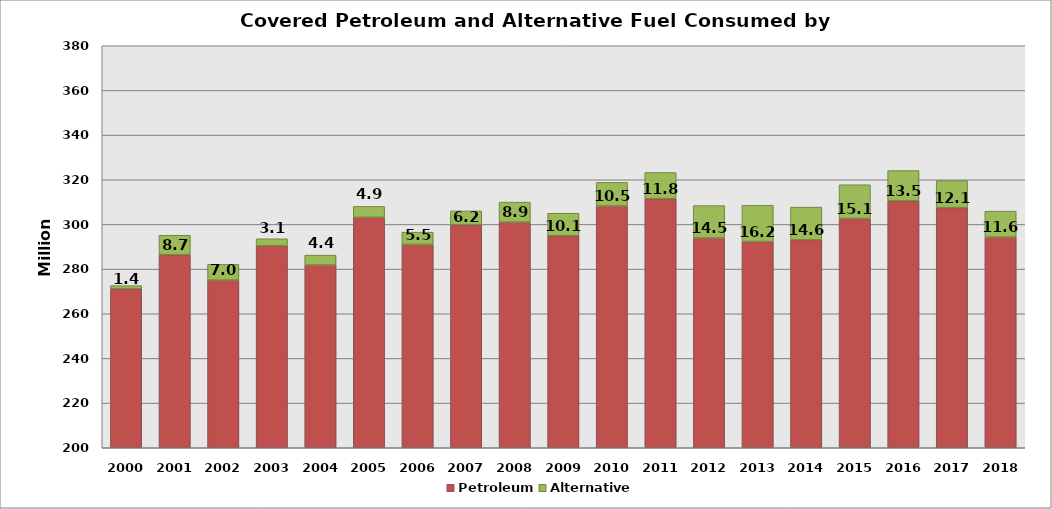
| Category |  Petroleum  | Alternative |
|---|---|---|
| 2000.0 | 271216176 | 1380837 |
| 2001.0 | 286457638 | 8696247 |
| 2002.0 | 275091679 | 7027164 |
| 2003.0 | 290506862 | 3073269 |
| 2004.0 | 281830103 | 4429460 |
| 2005.0 | 303188859 | 4879411 |
| 2006.0 | 291052076 | 5496332 |
| 2007.0 | 299876539 | 6186834 |
| 2008.0 | 301045891 | 8947801 |
| 2009.0 | 294913021 | 10093398 |
| 2010.0 | 308275507 | 10538475 |
| 2011.0 | 311511401 | 11759794 |
| 2012.0 | 293945538 | 14488408 |
| 2013.0 | 292338083 | 16217651 |
| 2014.0 | 293153365 | 14607813 |
| 2015.0 | 302673035 | 15100325 |
| 2016.0 | 310636590.527 | 13490718.34 |
| 2017.0 | 307496070.286 | 12106318.291 |
| 2018.0 | 294334846 | 11602924 |